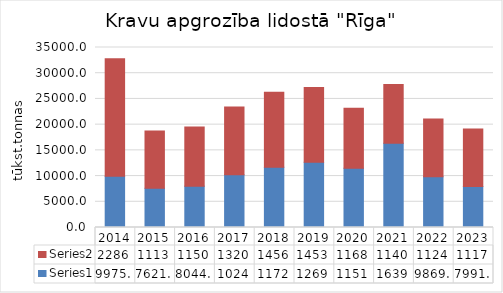
| Category | Series 0 | Series 1 |
|---|---|---|
| 2014.0 | 9975 | 22860 |
| 2015.0 | 7621 | 11136 |
| 2016.0 | 8044 | 11506 |
| 2017.0 | 10244 | 13205 |
| 2018.0 | 11722 | 14562 |
| 2019.0 | 12697 | 14532 |
| 2020.0 | 11510 | 11682 |
| 2021.0 | 16397 | 11405 |
| 2022.0 | 9869 | 11244 |
| 2023.0 | 7991 | 11172 |